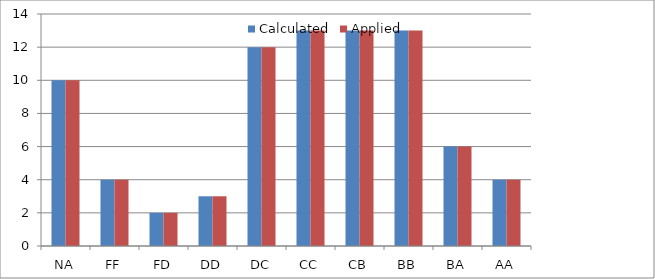
| Category | Calculated | Applied |
|---|---|---|
| NA | 10 | 10 |
| FF | 4 | 4 |
| FD | 2 | 2 |
| DD | 3 | 3 |
| DC | 12 | 12 |
| CC | 13 | 13 |
| CB | 13 | 13 |
| BB | 13 | 13 |
| BA | 6 | 6 |
| AA | 4 | 4 |